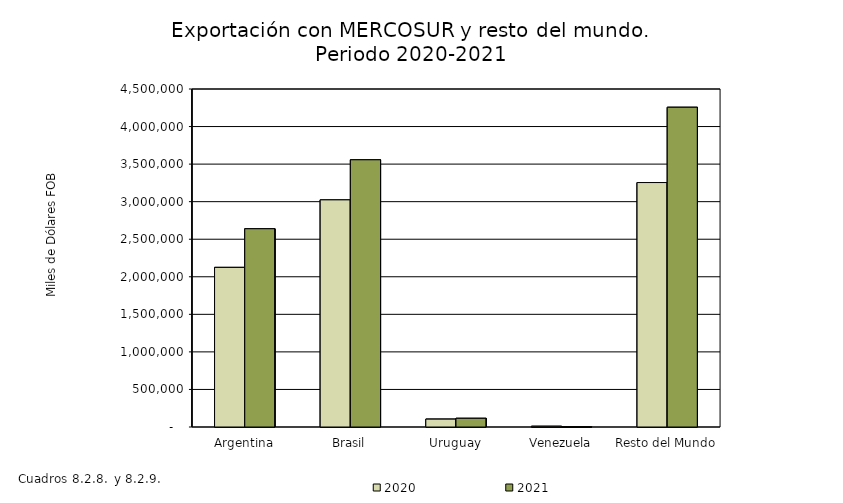
| Category | 2020 | 2021 |
|---|---|---|
| Argentina | 2125087 | 2639549.809 |
| Brasil | 3023937.16 | 3557458.469 |
| Uruguay | 104704.14 | 115819.815 |
| Venezuela | 9660.31 | 1365.4 |
| Resto del Mundo | 3254542.9 | 4256776.37 |